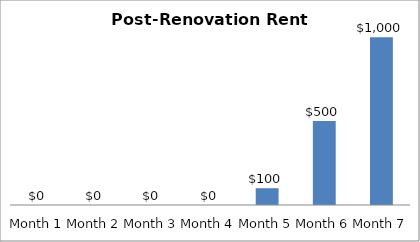
| Category | Series 0 |
|---|---|
| 0 | 0 |
| 1 | 0 |
| 2 | 0 |
| 3 | 0 |
| 4 | 100 |
| 5 | 500 |
| 6 | 1000 |